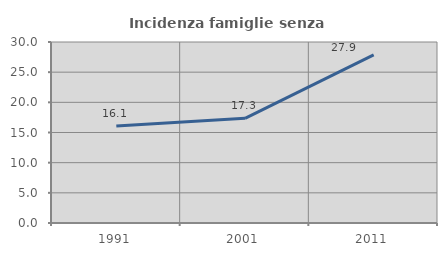
| Category | Incidenza famiglie senza nuclei |
|---|---|
| 1991.0 | 16.064 |
| 2001.0 | 17.347 |
| 2011.0 | 27.855 |